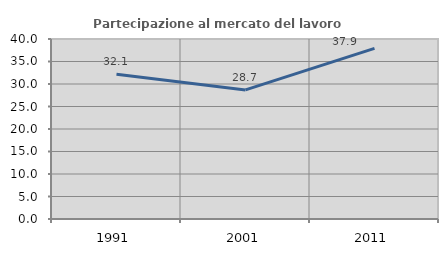
| Category | Partecipazione al mercato del lavoro  femminile |
|---|---|
| 1991.0 | 32.143 |
| 2001.0 | 28.689 |
| 2011.0 | 37.903 |